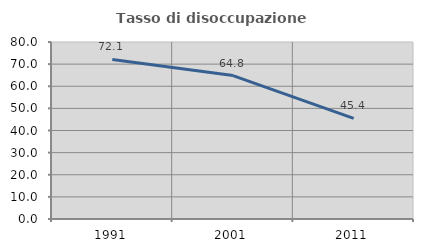
| Category | Tasso di disoccupazione giovanile  |
|---|---|
| 1991.0 | 72.125 |
| 2001.0 | 64.812 |
| 2011.0 | 45.446 |